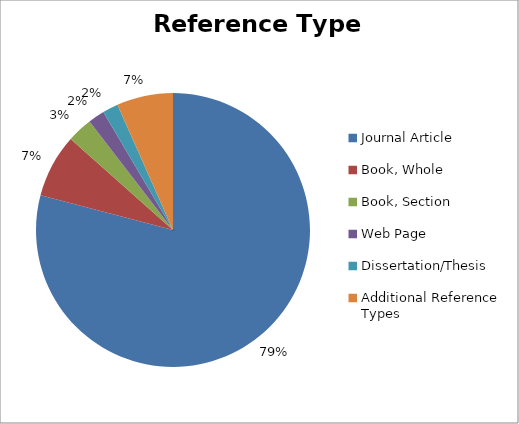
| Category | Series 0 |
|---|---|
| Journal Article | 98989 |
| Book, Whole | 9365 |
| Book, Section | 3746 |
| Web Page | 2427 |
| Dissertation/Thesis | 2313 |
| Additional Reference Types | 8316 |